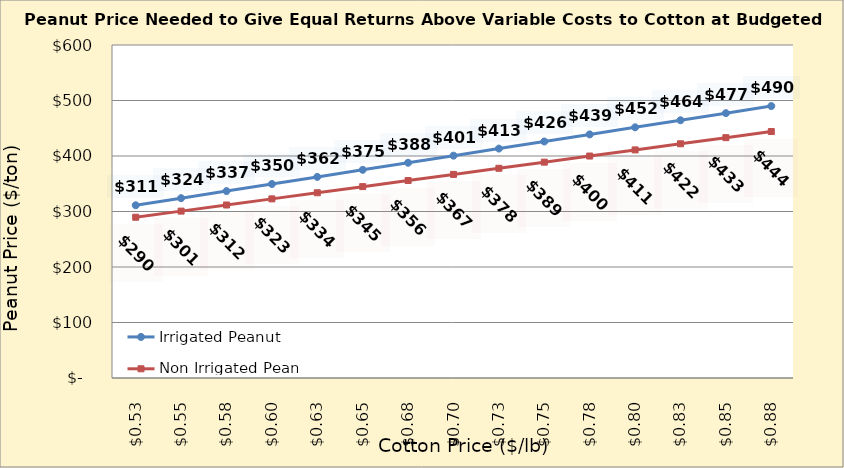
| Category | Irrigated Peanut | Non Irrigated Peanut |
|---|---|---|
| 0.5249999999999998 | 311.255 | 289.648 |
| 0.5499999999999998 | 324.021 | 300.678 |
| 0.5749999999999998 | 336.787 | 311.707 |
| 0.5999999999999999 | 349.553 | 322.737 |
| 0.6249999999999999 | 362.319 | 333.766 |
| 0.6499999999999999 | 375.085 | 344.795 |
| 0.6749999999999999 | 387.851 | 355.825 |
| 0.7 | 400.617 | 366.854 |
| 0.725 | 413.383 | 377.884 |
| 0.75 | 426.149 | 388.913 |
| 0.775 | 438.915 | 399.943 |
| 0.8 | 451.681 | 410.972 |
| 0.8250000000000001 | 464.447 | 422.001 |
| 0.8500000000000001 | 477.213 | 433.031 |
| 0.8750000000000001 | 489.979 | 444.06 |